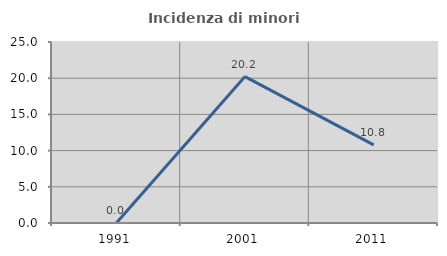
| Category | Incidenza di minori stranieri |
|---|---|
| 1991.0 | 0 |
| 2001.0 | 20.225 |
| 2011.0 | 10.791 |